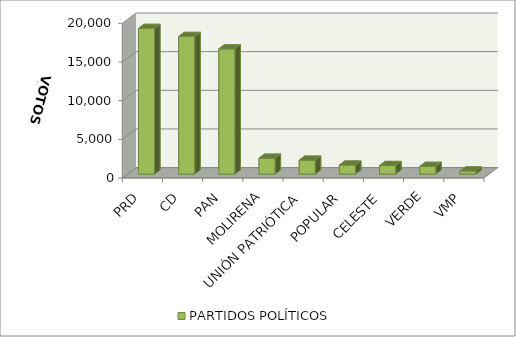
| Category | PARTIDOS POLÍTICOS |
|---|---|
| PRD | 18843 |
| CD | 17800 |
| PAN | 16197 |
| MOLIRENA | 2054 |
| UNIÓN PATRIÓTICA | 1796 |
| POPULAR | 1164 |
| CELESTE | 1106 |
| VERDE | 998 |
| VMP | 397 |